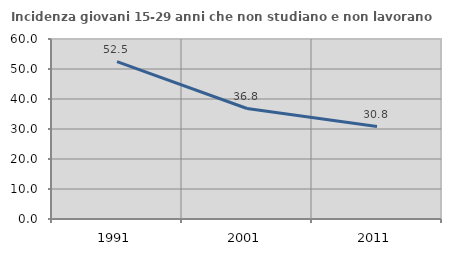
| Category | Incidenza giovani 15-29 anni che non studiano e non lavorano  |
|---|---|
| 1991.0 | 52.465 |
| 2001.0 | 36.827 |
| 2011.0 | 30.808 |